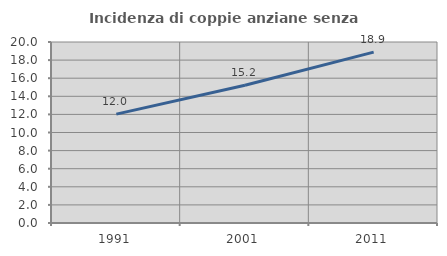
| Category | Incidenza di coppie anziane senza figli  |
|---|---|
| 1991.0 | 12.027 |
| 2001.0 | 15.222 |
| 2011.0 | 18.88 |